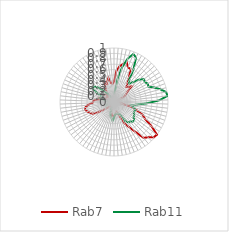
| Category | Rab7 | Rab11 |
|---|---|---|
| 0.0 | 0.372 | 0.123 |
| 0.10913 | 0.579 | 0.191 |
| 0.21825 | 0.669 | 0.44 |
| 0.32738 | 0.721 | 0.664 |
| 0.43651 | 0.776 | 0.842 |
| 0.54563 | 0.693 | 0.958 |
| 0.65476 | 0.682 | 0.92 |
| 0.76389 | 0.55 | 0.708 |
| 0.87302 | 0.439 | 0.476 |
| 0.98214 | 0.362 | 0.441 |
| 1.09127 | 0.389 | 0.512 |
| 1.2004 | 0.434 | 0.625 |
| 1.30952 | 0.315 | 0.698 |
| 1.41865 | 0.318 | 0.679 |
| 1.52778 | 0.222 | 0.713 |
| 1.6369 | 0.064 | 0.697 |
| 1.74603 | 0.042 | 0.793 |
| 1.85516 | 0.081 | 0.889 |
| 1.96429 | 0.074 | 0.979 |
| 2.07341 | 0.048 | 1 |
| 2.18254 | 0.064 | 0.84 |
| 2.29167 | 0.068 | 0.614 |
| 2.40079 | 0.157 | 0.419 |
| 2.50992 | 0.114 | 0.325 |
| 2.61905 | 0.33 | 0.375 |
| 2.72817 | 0.441 | 0.419 |
| 2.8373 | 0.582 | 0.419 |
| 2.94643 | 0.654 | 0.416 |
| 3.05556 | 0.83 | 0.448 |
| 3.16468 | 1 | 0.455 |
| 3.27381 | 0.982 | 0.499 |
| 3.38294 | 0.906 | 0.505 |
| 3.49206 | 0.86 | 0.467 |
| 3.60119 | 0.662 | 0.461 |
| 3.71032 | 0.536 | 0.41 |
| 3.81944 | 0.443 | 0.257 |
| 3.92857 | 0.304 | 0.233 |
| 4.0377 | 0.213 | 0.242 |
| 4.14683 | 0.183 | 0.221 |
| 4.25595 | 0.213 | 0.234 |
| 4.36508 | 0.246 | 0.236 |
| 4.47421 | 0.262 | 0.293 |
| 4.58333 | 0.253 | 0.351 |
| 4.69246 | 0.256 | 0.302 |
| 4.80159 | 0.244 | 0.275 |
| 4.91071 | 0.162 | 0.223 |
| 5.01984 | 0.118 | 0.133 |
| 5.12897 | 0.114 | 0.053 |
| 5.2381 | 0.085 | 0.061 |
| 5.34722 | 0 | 0.01 |
| 5.45635 | 0.092 | 0.021 |
| 5.56548 | 0.097 | 0 |
| 5.6746 | 0.161 | 0.014 |
| 5.78373 | 0.228 | 0.035 |
| 5.89286 | 0.349 | 0.059 |
| 6.00198 | 0.458 | 0.08 |
| 6.11111 | 0.485 | 0.144 |
| 6.22024 | 0.524 | 0.138 |
| 6.32937 | 0.552 | 0.124 |
| 6.43849 | 0.541 | 0.117 |
| 6.54762 | 0.488 | 0.095 |
| 6.65675 | 0.395 | 0.087 |
| 6.76587 | 0.382 | 0.071 |
| 6.875 | 0.363 | 0.108 |
| 6.98413 | 0.253 | 0.177 |
| 7.09325 | 0.285 | 0.257 |
| 7.20238 | 0.208 | 0.218 |
| 7.31151 | 0.072 | 0.246 |
| 7.42063 | 0.179 | 0.373 |
| 7.52976 | 0.139 | 0.477 |
| 7.63889 | 0.231 | 0.469 |
| 7.74802 | 0.175 | 0.41 |
| 7.85714 | 0.161 | 0.307 |
| 7.96627 | 0.226 | 0.24 |
| 8.0754 | 0.244 | 0.158 |
| 8.18452 | 0.311 | 0.08 |
| 8.29365 | 0.387 | 0.091 |
| 8.40278 | 0.359 | 0.049 |
| 8.5119 | 0.405 | 0.04 |
| 8.62103 | 0.455 | 0.035 |
| 8.73016 | 0.352 | 0.103 |
| 8.83929 | 0.337 | 0.099 |